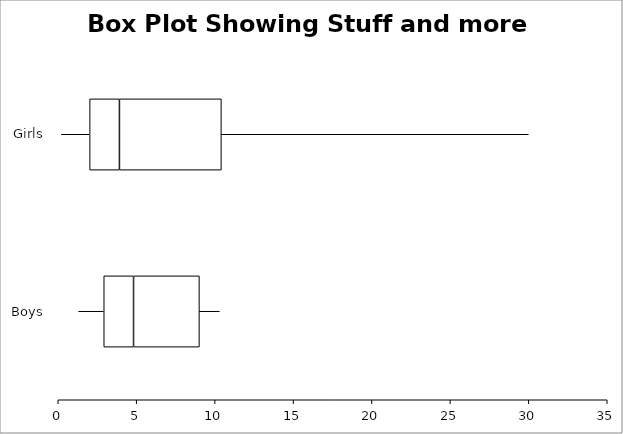
| Category | Minimum | Lower Quartile | Median | Upper Quartile | Maximum |
|---|---|---|---|---|---|
| Boys | 1.3 | 1.6 | 1.9 | 4.2 | 1.3 |
| Girls | 0.2 | 1.8 | 1.9 | 6.5 | 19.6 |